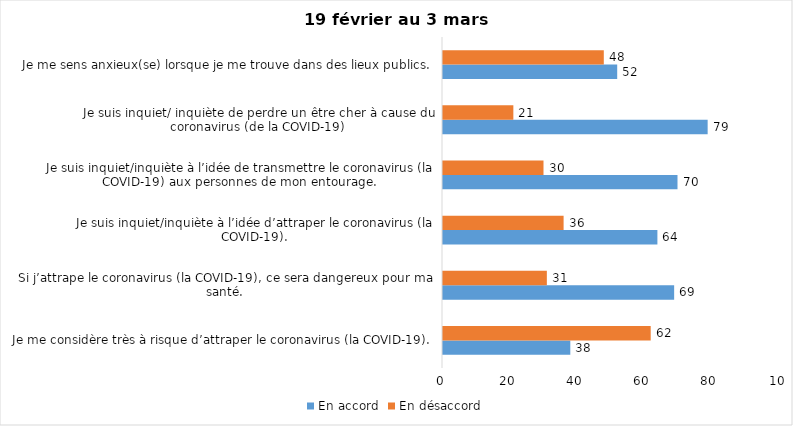
| Category | En accord | En désaccord |
|---|---|---|
| Je me considère très à risque d’attraper le coronavirus (la COVID-19). | 38 | 62 |
| Si j’attrape le coronavirus (la COVID-19), ce sera dangereux pour ma santé. | 69 | 31 |
| Je suis inquiet/inquiète à l’idée d’attraper le coronavirus (la COVID-19). | 64 | 36 |
| Je suis inquiet/inquiète à l’idée de transmettre le coronavirus (la COVID-19) aux personnes de mon entourage. | 70 | 30 |
| Je suis inquiet/ inquiète de perdre un être cher à cause du coronavirus (de la COVID-19) | 79 | 21 |
| Je me sens anxieux(se) lorsque je me trouve dans des lieux publics. | 52 | 48 |